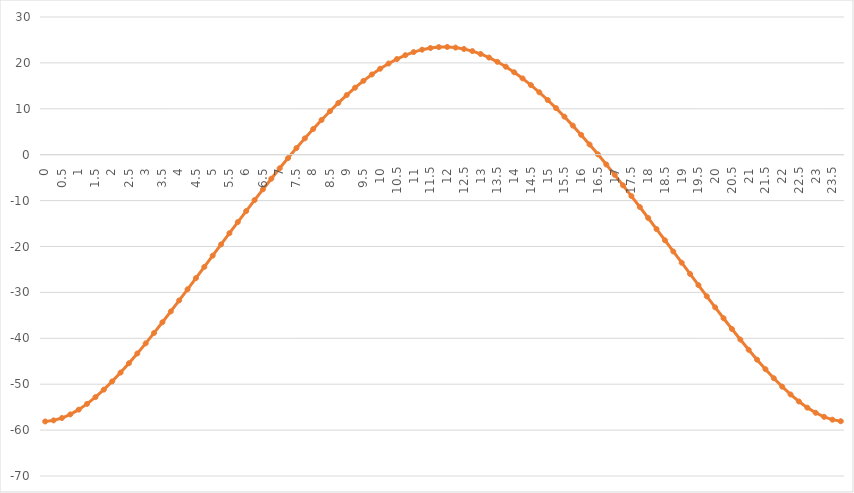
| Category | výsledek [°] |
|---|---|
| 0.0 | -58.122 |
| 0.25 | -57.886 |
| 0.5 | -57.368 |
| 0.75 | -56.582 |
| 1.0 | -55.547 |
| 1.25 | -54.285 |
| 1.5 | -52.823 |
| 1.75 | -51.183 |
| 2.0 | -49.391 |
| 2.25 | -47.468 |
| 2.5 | -45.434 |
| 2.75 | -43.306 |
| 3.0 | -41.101 |
| 3.25 | -38.83 |
| 3.5 | -36.508 |
| 3.75 | -34.143 |
| 4.0 | -31.746 |
| 4.25 | -29.325 |
| 4.5 | -26.887 |
| 4.75 | -24.44 |
| 5.0 | -21.99 |
| 5.25 | -19.542 |
| 5.5 | -17.103 |
| 5.75 | -14.678 |
| 6.0 | -12.273 |
| 6.25 | -9.892 |
| 6.5 | -7.543 |
| 6.75 | -5.229 |
| 7.0 | -2.956 |
| 7.25 | -0.731 |
| 7.5 | 1.441 |
| 7.75 | 3.553 |
| 8.0 | 5.6 |
| 8.25 | 7.573 |
| 8.5 | 9.467 |
| 8.75 | 11.274 |
| 9.0 | 12.986 |
| 9.25 | 14.596 |
| 9.5 | 16.096 |
| 9.75 | 17.478 |
| 10.0 | 18.734 |
| 10.25 | 19.857 |
| 10.5 | 20.839 |
| 10.75 | 21.675 |
| 11.0 | 22.357 |
| 11.25 | 22.882 |
| 11.5 | 23.244 |
| 11.75 | 23.441 |
| 12.0 | 23.472 |
| 12.25 | 23.336 |
| 12.5 | 23.035 |
| 12.75 | 22.57 |
| 13.0 | 21.945 |
| 13.25 | 21.166 |
| 13.5 | 20.237 |
| 13.75 | 19.165 |
| 14.0 | 17.957 |
| 14.25 | 16.621 |
| 14.5 | 15.164 |
| 14.75 | 13.593 |
| 15.0 | 11.918 |
| 15.25 | 10.146 |
| 15.5 | 8.283 |
| 15.75 | 6.338 |
| 16.0 | 4.318 |
| 16.25 | 2.229 |
| 16.5 | 0.079 |
| 16.75 | -2.128 |
| 17.0 | -4.383 |
| 17.25 | -6.683 |
| 17.5 | -9.02 |
| 17.75 | -11.39 |
| 18.0 | -13.786 |
| 18.25 | -16.205 |
| 18.5 | -18.639 |
| 18.75 | -21.084 |
| 19.0 | -23.534 |
| 19.25 | -25.984 |
| 19.5 | -28.426 |
| 19.75 | -30.854 |
| 20.0 | -33.26 |
| 20.25 | -35.638 |
| 20.5 | -37.977 |
| 20.75 | -40.268 |
| 21.0 | -42.499 |
| 21.25 | -44.658 |
| 21.5 | -46.728 |
| 21.75 | -48.695 |
| 22.0 | -50.537 |
| 22.25 | -52.236 |
| 22.5 | -53.767 |
| 22.75 | -55.105 |
| 23.0 | -56.227 |
| 23.25 | -57.108 |
| 23.5 | -57.727 |
| 23.75 | -58.068 |